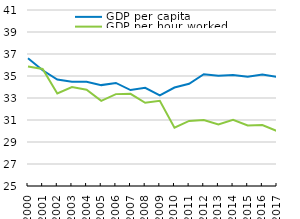
| Category | GDP per capita | GDP per hour worked |
|---|---|---|
| 2000.0 | 36.614 | 35.862 |
| 2001.0 | 35.524 | 35.633 |
| 2002.0 | 34.675 | 33.418 |
| 2003.0 | 34.474 | 33.988 |
| 2004.0 | 34.474 | 33.754 |
| 2005.0 | 34.172 | 32.744 |
| 2006.0 | 34.371 | 33.353 |
| 2007.0 | 33.721 | 33.384 |
| 2008.0 | 33.927 | 32.561 |
| 2009.0 | 33.238 | 32.741 |
| 2010.0 | 33.954 | 30.296 |
| 2011.0 | 34.291 | 30.916 |
| 2012.0 | 35.165 | 30.992 |
| 2013.0 | 35.027 | 30.588 |
| 2014.0 | 35.1 | 31.01 |
| 2015.0 | 34.941 | 30.498 |
| 2016.0 | 35.128 | 30.549 |
| 2017.0 | 34.923 | 29.992 |